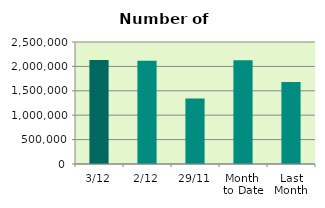
| Category | Series 0 |
|---|---|
| 3/12 | 2132994 |
| 2/12 | 2114964 |
| 29/11 | 1339764 |
| Month 
to Date | 2123979 |
| Last
Month | 1681386.857 |